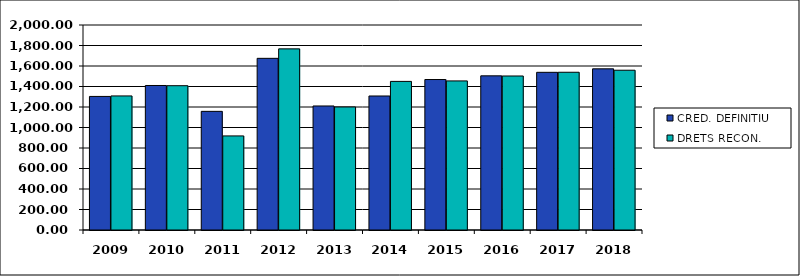
| Category | CRED. DEFINITIU | DRETS RECON. |
|---|---|---|
| 2009.0 | 1303.06 | 1307.95 |
| 2010.0 | 1409.87 | 1407.82 |
| 2011.0 | 1157.53 | 917.94 |
| 2012.0 | 1674.76 | 1767.15 |
| 2013.0 | 1209.96 | 1200.44 |
| 2014.0 | 1307.45 | 1449.83 |
| 2015.0 | 1468.11 | 1454.43 |
| 2016.0 | 1504.11 | 1502.51 |
| 2017.0 | 1538.35 | 1538.96 |
| 2018.0 | 1572.53 | 1558.83 |